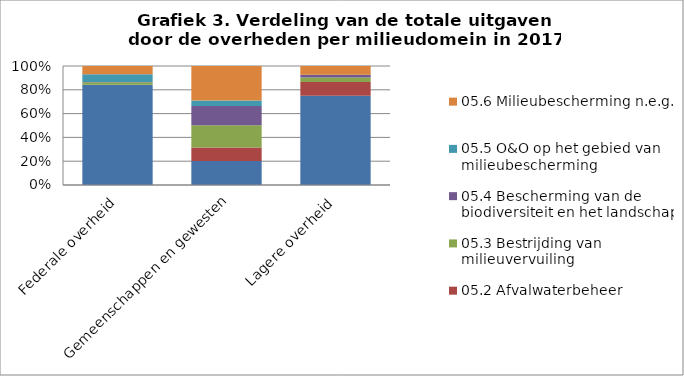
| Category | 05.1 Afvalbeheer | 05.2 Afvalwaterbeheer | 05.3 Bestrijding van milieuvervuiling | 05.4 Bescherming van de biodiversiteit en het landschap | 05.5 O&O op het gebied van milieubescherming | 05.6 Milieubescherming n.e.g. |
|---|---|---|---|---|---|---|
| Federale overheid | 316.1 | 0 | 7.9 | 0.9 | 24.5 | 25.9 |
| Gemeenschappen en gewesten | 268.9 | 152.2 | 248.8 | 217.7 | 60.7 | 387.1 |
| Lagere overheid | 1810.8 | 277.8 | 88.6 | 58.8 | 0 | 175.9 |